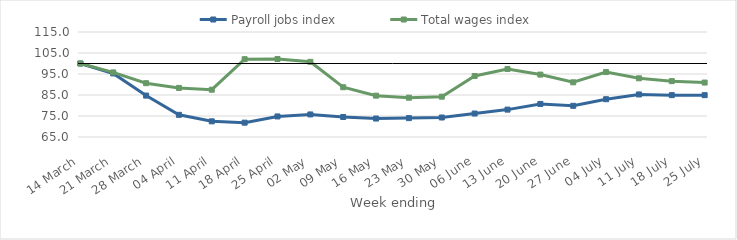
| Category | Payroll jobs index | Total wages index |
|---|---|---|
| 2020-03-14 | 100 | 100 |
| 2020-03-21 | 95.261 | 95.76 |
| 2020-03-28 | 84.721 | 90.623 |
| 2020-04-04 | 75.558 | 88.375 |
| 2020-04-11 | 72.462 | 87.513 |
| 2020-04-18 | 71.827 | 102.053 |
| 2020-04-25 | 74.787 | 102.156 |
| 2020-05-02 | 75.743 | 100.795 |
| 2020-05-09 | 74.518 | 88.691 |
| 2020-05-16 | 73.783 | 84.685 |
| 2020-05-23 | 73.988 | 83.717 |
| 2020-05-30 | 74.284 | 84.201 |
| 2020-06-06 | 76.175 | 94.04 |
| 2020-06-13 | 78.041 | 97.373 |
| 2020-06-20 | 80.745 | 94.723 |
| 2020-06-27 | 79.855 | 91.045 |
| 2020-07-04 | 82.997 | 95.926 |
| 2020-07-11 | 85.265 | 92.948 |
| 2020-07-18 | 84.927 | 91.605 |
| 2020-07-25 | 84.924 | 90.921 |